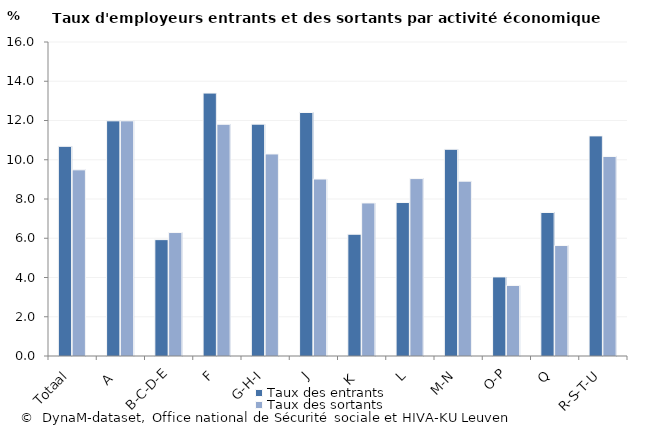
| Category | Taux des entrants | Taux des sortants |
|---|---|---|
| Totaal | 10.685 | 9.486 |
| A  | 11.983 | 11.983 |
| B-C-D-E | 5.93 | 6.291 |
| F  | 13.398 | 11.807 |
| G-H-I | 11.814 | 10.295 |
| J | 12.408 | 9.018 |
| K  | 6.205 | 7.799 |
| L | 7.821 | 9.04 |
| M-N | 10.535 | 8.909 |
| O-P | 4.03 | 3.595 |
| Q | 7.313 | 5.629 |
| R-S-T-U | 11.216 | 10.166 |